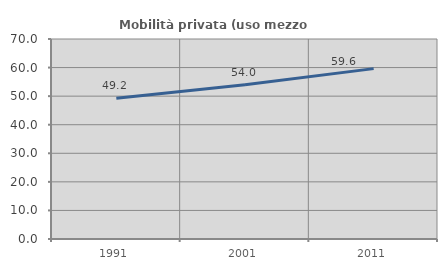
| Category | Mobilità privata (uso mezzo privato) |
|---|---|
| 1991.0 | 49.248 |
| 2001.0 | 54.023 |
| 2011.0 | 59.627 |